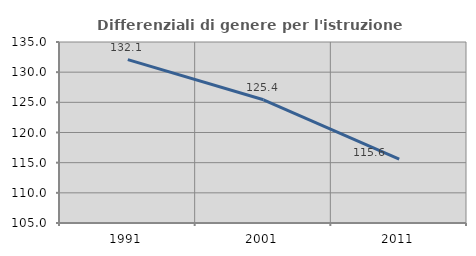
| Category | Differenziali di genere per l'istruzione superiore |
|---|---|
| 1991.0 | 132.079 |
| 2001.0 | 125.426 |
| 2011.0 | 115.607 |